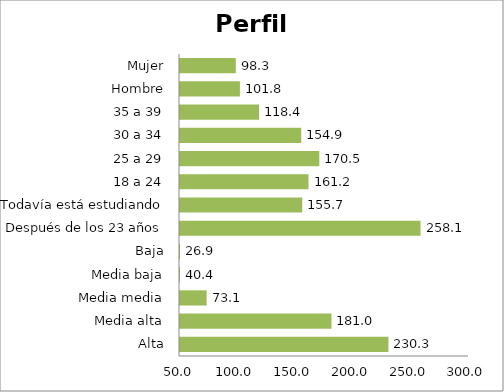
| Category | Series 2 |
|---|---|
| Alta | 230.293 |
| Media alta | 181.013 |
| Media media | 73.055 |
| Media baja | 40.351 |
| Baja | 26.86 |
| Después de los 23 años | 258.086 |
| Todavía está estudiando | 155.745 |
| 18 a 24 | 161.176 |
| 25 a 29 | 170.495 |
| 30 a 34 | 154.851 |
| 35 a 39 | 118.378 |
| Hombre | 101.838 |
| Mujer | 98.275 |